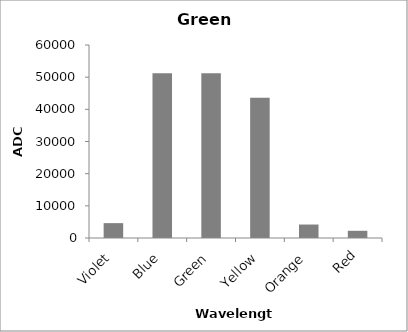
| Category | Green LED |
|---|---|
| Violet | 4621 |
| Blue | 51201 |
| Green | 51201 |
| Yellow | 43604 |
| Orange | 4186 |
| Red | 2239 |